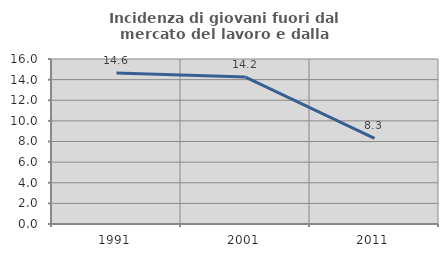
| Category | Incidenza di giovani fuori dal mercato del lavoro e dalla formazione  |
|---|---|
| 1991.0 | 14.637 |
| 2001.0 | 14.248 |
| 2011.0 | 8.307 |